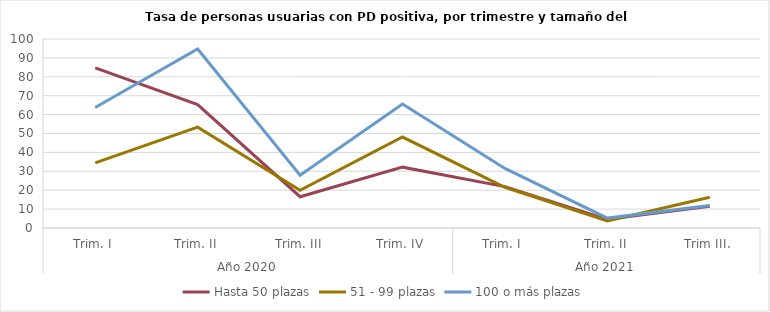
| Category | Hasta 50 plazas | 51 - 99 plazas | 100 o más plazas |
|---|---|---|---|
| 0 | 84.761 | 34.493 | 63.756 |
| 1 | 65.335 | 53.333 | 94.708 |
| 2 | 16.554 | 19.988 | 27.917 |
| 3 | 32.192 | 48.132 | 65.614 |
| 4 | 21.884 | 21.548 | 31.522 |
| 5 | 4.583 | 3.719 | 5.235 |
| 6 | 11.446 | 16.226 | 11.867 |